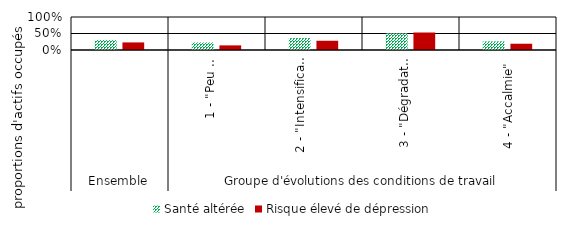
| Category | Santé altérée | Risque élevé de dépression |
|---|---|---|
| 0 | 0.3 | 0.23 |
| 1 | 0.23 | 0.14 |
| 2 | 0.36 | 0.28 |
| 3 | 0.5 | 0.53 |
| 4 | 0.26 | 0.19 |